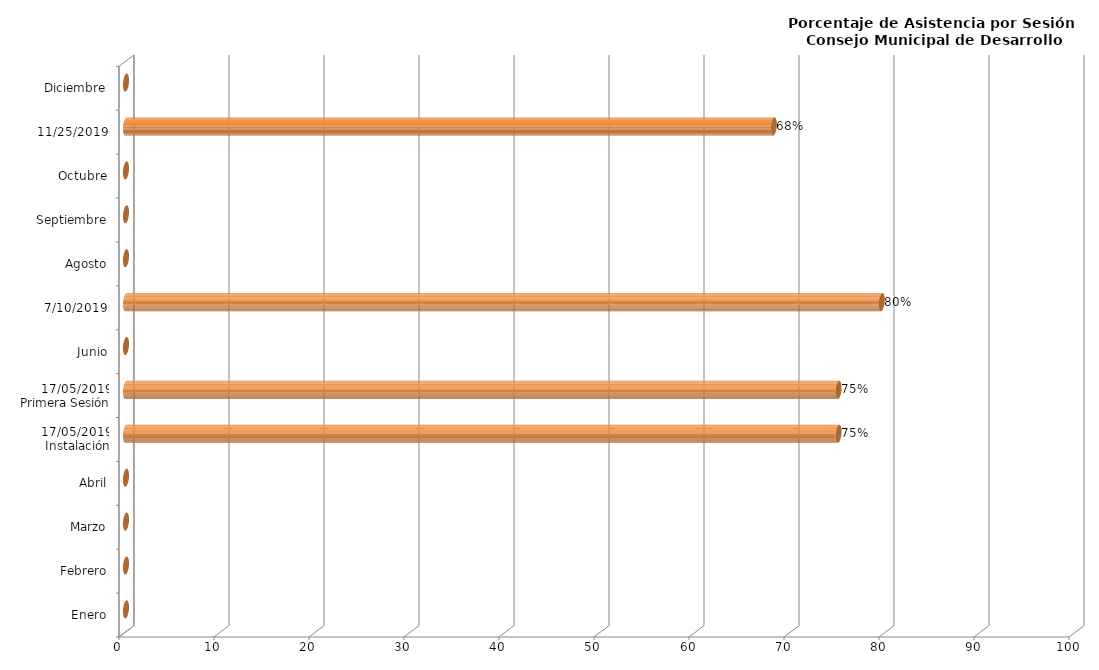
| Category | Series 0 |
|---|---|
| Enero | 0 |
| Febrero | 0 |
| Marzo | 0 |
| Abril | 0 |
| 17/05/2019
Instalación | 75 |
| 17/05/2019
Primera Sesión | 75 |
| Junio | 0 |
| 10/07/2019 | 79.545 |
| Agosto | 0 |
| Septiembre | 0 |
| Octubre | 0 |
| 25/11/2019 | 68.182 |
| Diciembre | 0 |